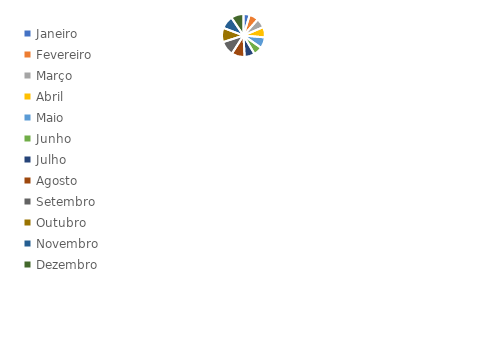
| Category | ATENDIMENTOS |
|---|---|
| Janeiro | 56 |
| Fevereiro | 83 |
| Março | 85 |
| Abril | 94 |
| Maio | 100 |
| Junho | 81 |
| Julho | 93 |
| Agosto | 119 |
| Setembro | 132 |
| Outubro | 129 |
| Novembro | 118 |
| Dezembro | 114 |